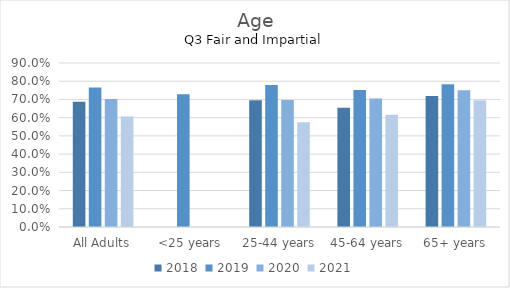
| Category | 2018 | 2019 | 2020 | 2021 |
|---|---|---|---|---|
| All Adults | 0.687 | 0.766 | 0.703 | 0.607 |
| <25 years | 0 | 0.729 | 0 | 0 |
| 25-44 years | 0.696 | 0.779 | 0.697 | 0.575 |
| 45-64 years | 0.655 | 0.752 | 0.705 | 0.616 |
| 65+ years | 0.719 | 0.784 | 0.751 | 0.696 |